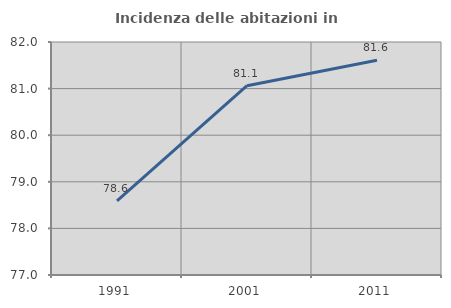
| Category | Incidenza delle abitazioni in proprietà  |
|---|---|
| 1991.0 | 78.588 |
| 2001.0 | 81.062 |
| 2011.0 | 81.608 |